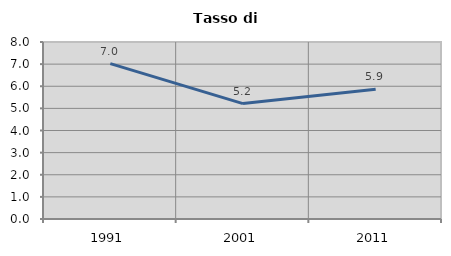
| Category | Tasso di disoccupazione   |
|---|---|
| 1991.0 | 7.025 |
| 2001.0 | 5.215 |
| 2011.0 | 5.861 |